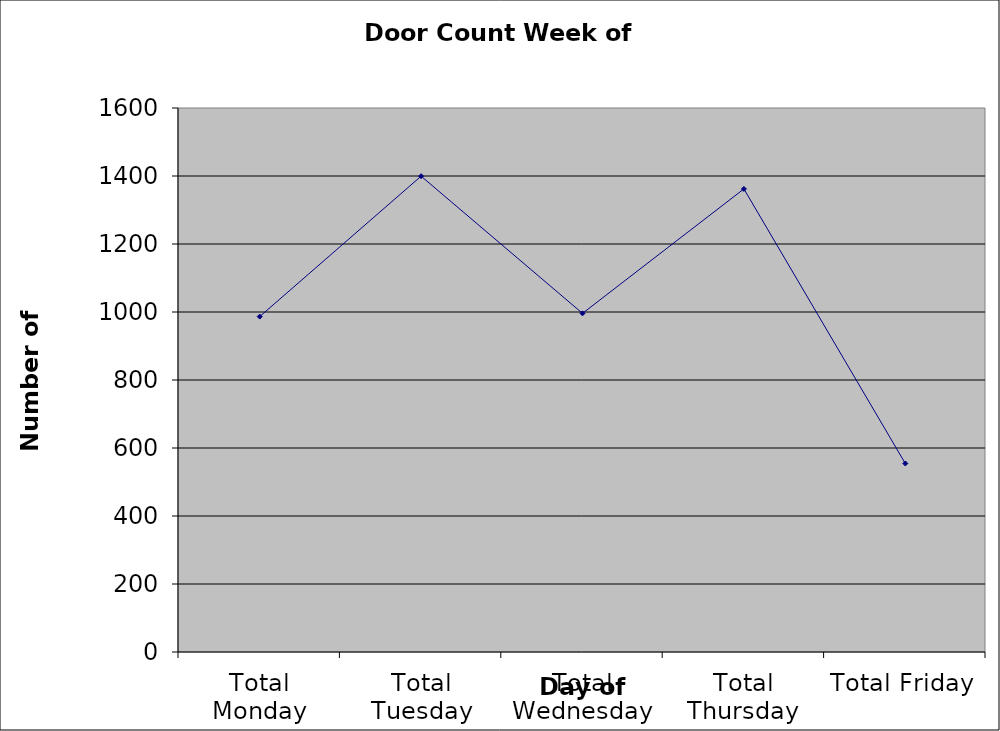
| Category | Series 0 |
|---|---|
| Total Monday | 986.5 |
| Total Tuesday | 1399.5 |
| Total Wednesday | 996 |
| Total Thursday | 1362 |
| Total Friday | 554.5 |